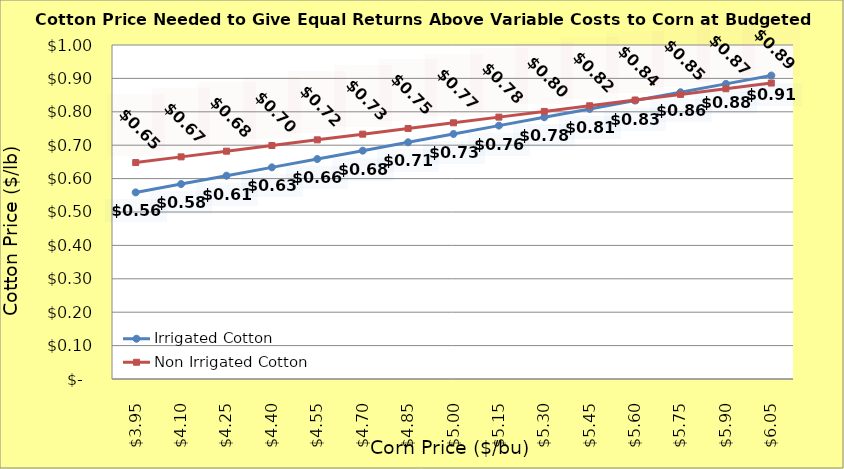
| Category | Irrigated Cotton | Non Irrigated Cotton |
|---|---|---|
| 3.949999999999998 | 0.559 | 0.648 |
| 4.099999999999998 | 0.584 | 0.665 |
| 4.249999999999998 | 0.609 | 0.682 |
| 4.399999999999999 | 0.634 | 0.699 |
| 4.549999999999999 | 0.659 | 0.716 |
| 4.699999999999999 | 0.684 | 0.733 |
| 4.85 | 0.709 | 0.75 |
| 5.0 | 0.734 | 0.767 |
| 5.15 | 0.759 | 0.784 |
| 5.300000000000001 | 0.784 | 0.801 |
| 5.450000000000001 | 0.809 | 0.818 |
| 5.600000000000001 | 0.834 | 0.835 |
| 5.750000000000002 | 0.859 | 0.852 |
| 5.900000000000002 | 0.884 | 0.869 |
| 6.0500000000000025 | 0.909 | 0.886 |